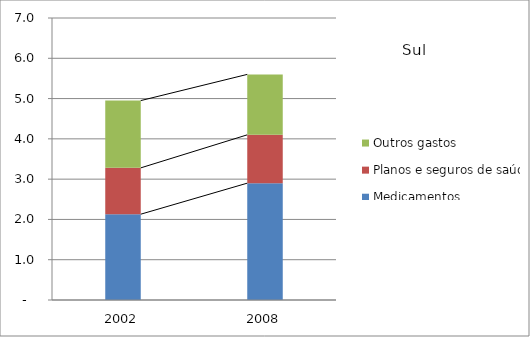
| Category | Medicamentos | Planos e seguros de saúde | Outros gastos |
|---|---|---|---|
| 2002.0 | 2.13 | 1.15 | 1.67 |
| 2008.0 | 2.9 | 1.2 | 1.5 |